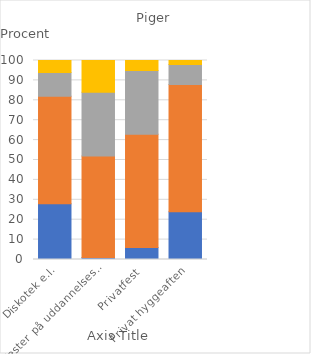
| Category | En eller flere gange om ugen | Mindst hver anden måned | Sjældnerere | Aldrig |
|---|---|---|---|---|
| Diskotek e.l. | 28 | 54 | 12 | 6 |
| Fester på uddannelsessted | 1 | 51 | 32 | 16 |
| Privatfest | 6 | 57 | 32 | 5 |
| Privat hyggeaften | 24 | 64 | 10 | 2 |